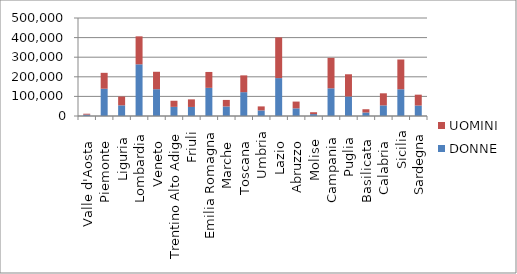
| Category | DONNE | UOMINI |
|---|---|---|
|  Valle d'Aosta   | 7023 | 4591 |
|  Piemonte   | 139187 | 81063 |
|  Liguria  | 54422 | 44859 |
| Lombardia | 263683 | 142746 |
|  Veneto   | 136774 | 88861 |
|  Trentino Alto Adige | 46672 | 31122 |
| Friuli | 46213 | 38583 |
| Emilia Romagna | 143621 | 81098 |
|  Marche   | 48629 | 33373 |
|  Toscana   | 121631 | 85639 |
| Umbria | 28516 | 20480 |
|  Lazio   | 193326 | 207733 |
|  Abruzzo   | 39035 | 34517 |
|  Molise   | 9703 | 9558 |
|  Campania  | 141288 | 155463 |
|  Puglia  | 99533 | 113369 |
|  Basilicata   | 17770 | 16742 |
|  Calabria   | 54148 | 61639 |
| Sicilia | 136463 | 151815 |
| Sardegna | 53401 | 55429 |